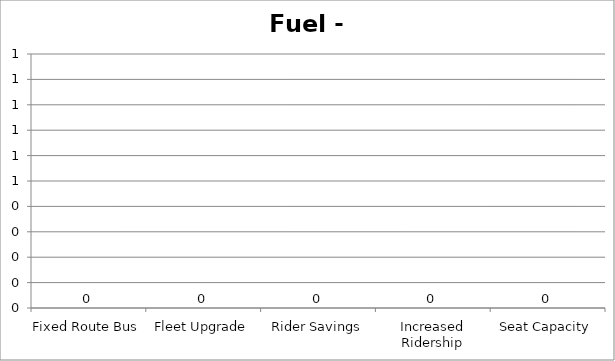
| Category | Fuel - GGE |
|---|---|
| Fixed Route Bus | 0 |
| Fleet Upgrade | 0 |
| Rider Savings | 0 |
| Increased Ridership | 0 |
| Seat Capacity | 0 |